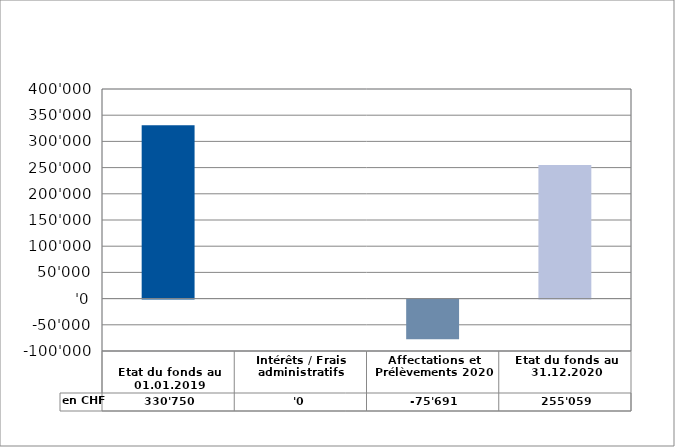
| Category | en CHF |
|---|---|
| 
Etat du fonds au 01.01.2019

 | 330750 |
| Intérêts / Frais administratifs | 0 |
| Affectations et Prélèvements 2020 | -75691 |
| Etat du fonds au 31.12.2020 | 255059 |